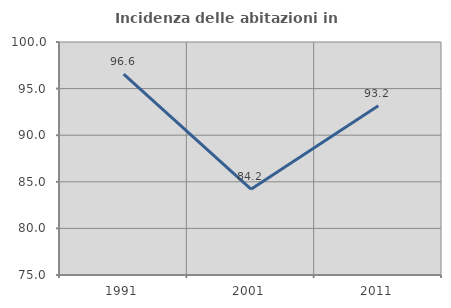
| Category | Incidenza delle abitazioni in proprietà  |
|---|---|
| 1991.0 | 96.552 |
| 2001.0 | 84.211 |
| 2011.0 | 93.151 |